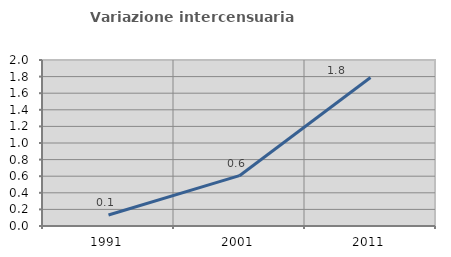
| Category | Variazione intercensuaria annua |
|---|---|
| 1991.0 | 0.133 |
| 2001.0 | 0.606 |
| 2011.0 | 1.789 |